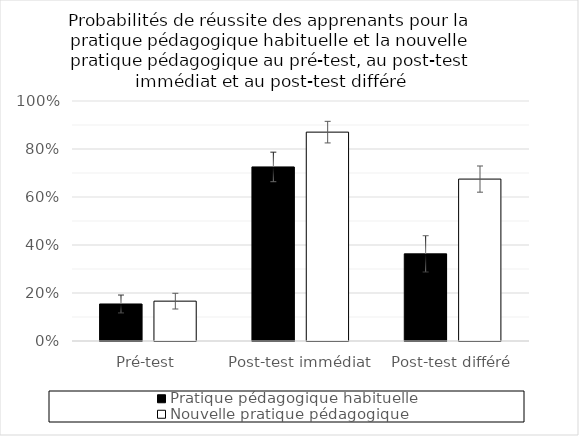
| Category | Pratique pédagogique habituelle | Nouvelle pratique pédagogique |
|---|---|---|
| Pré-test | 0.154 | 0.166 |
| Post-test immédiat | 0.725 | 0.87 |
| Post-test différé | 0.363 | 0.675 |